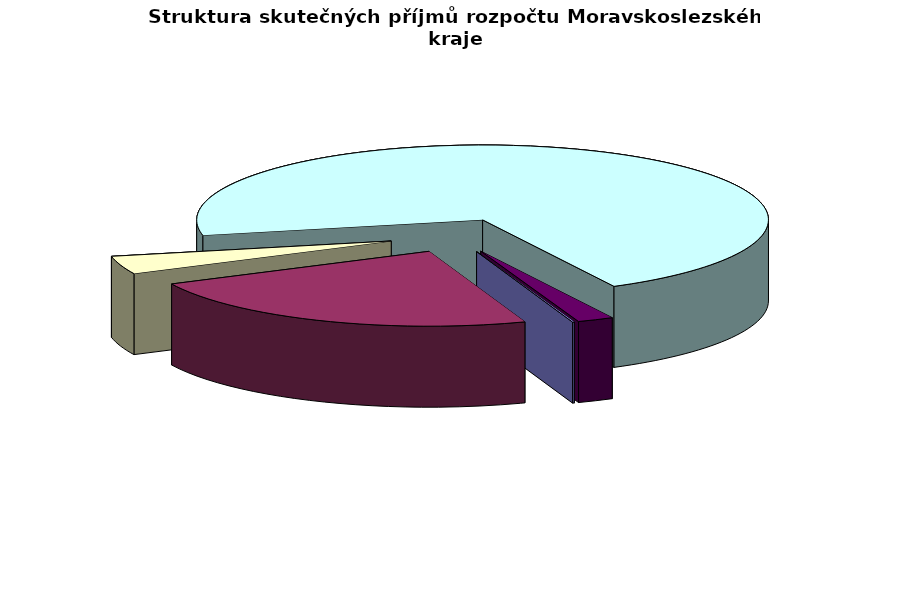
| Category | Čerpání v tis. Kč |
|---|---|
| Kapitálové příjmy | 31750.271 |
| Daňové příjmy | 7028054.87 |
| Investiční dotace | 1175364.415 |
| Neinvestiční dotace | 21346426.871 |
| Nedaňové příjmy | 618728.645 |